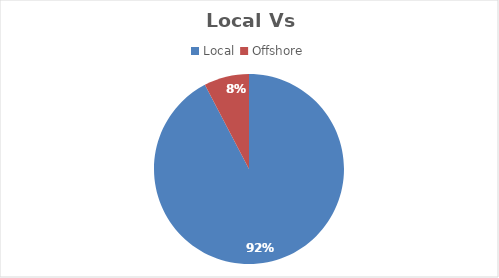
| Category | Series 0 |
|---|---|
| Local  | 0.923 |
| Offshore | 0.077 |